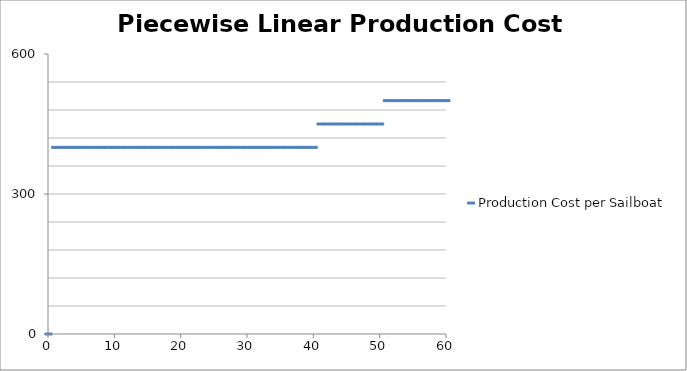
| Category | Production Cost per Sailboat |
|---|---|
| 0.0 | 0 |
| 1.0 | 400 |
| 2.0 | 400 |
| 3.0 | 400 |
| 4.0 | 400 |
| 5.0 | 400 |
| 6.0 | 400 |
| 7.0 | 400 |
| 8.0 | 400 |
| 9.0 | 400 |
| 10.0 | 400 |
| 11.0 | 400 |
| 12.0 | 400 |
| 13.0 | 400 |
| 14.0 | 400 |
| 15.0 | 400 |
| 16.0 | 400 |
| 17.0 | 400 |
| 18.0 | 400 |
| 19.0 | 400 |
| 20.0 | 400 |
| 21.0 | 400 |
| 22.0 | 400 |
| 23.0 | 400 |
| 24.0 | 400 |
| 25.0 | 400 |
| 26.0 | 400 |
| 27.0 | 400 |
| 28.0 | 400 |
| 29.0 | 400 |
| 30.0 | 400 |
| 31.0 | 400 |
| 32.0 | 400 |
| 33.0 | 400 |
| 34.0 | 400 |
| 35.0 | 400 |
| 36.0 | 400 |
| 37.0 | 400 |
| 38.0 | 400 |
| 39.0 | 400 |
| 40.0 | 400 |
| 41.0 | 450 |
| 42.0 | 450 |
| 43.0 | 450 |
| 44.0 | 450 |
| 45.0 | 450 |
| 46.0 | 450 |
| 47.0 | 450 |
| 48.0 | 450 |
| 49.0 | 450 |
| 50.0 | 450 |
| 51.0 | 500 |
| 52.0 | 500 |
| 53.0 | 500 |
| 54.0 | 500 |
| 55.0 | 500 |
| 56.0 | 500 |
| 57.0 | 500 |
| 58.0 | 500 |
| 59.0 | 500 |
| 60.0 | 500 |